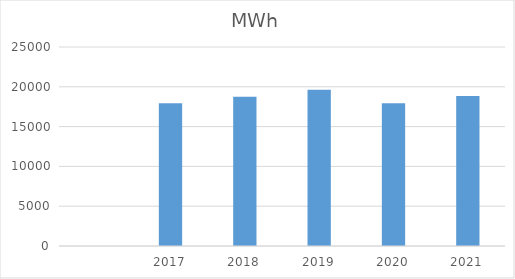
| Category | MWh |
|---|---|
| nan | 0 |
| 2017.0 | 17927.892 |
| 2018.0 | 18738.522 |
| 2019.0 | 19614.201 |
| 2020.0 | 17940.45 |
| 2021.0 | 18830.693 |